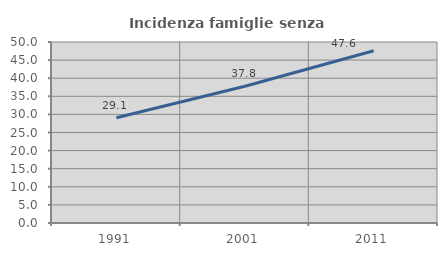
| Category | Incidenza famiglie senza nuclei |
|---|---|
| 1991.0 | 29.052 |
| 2001.0 | 37.784 |
| 2011.0 | 47.569 |